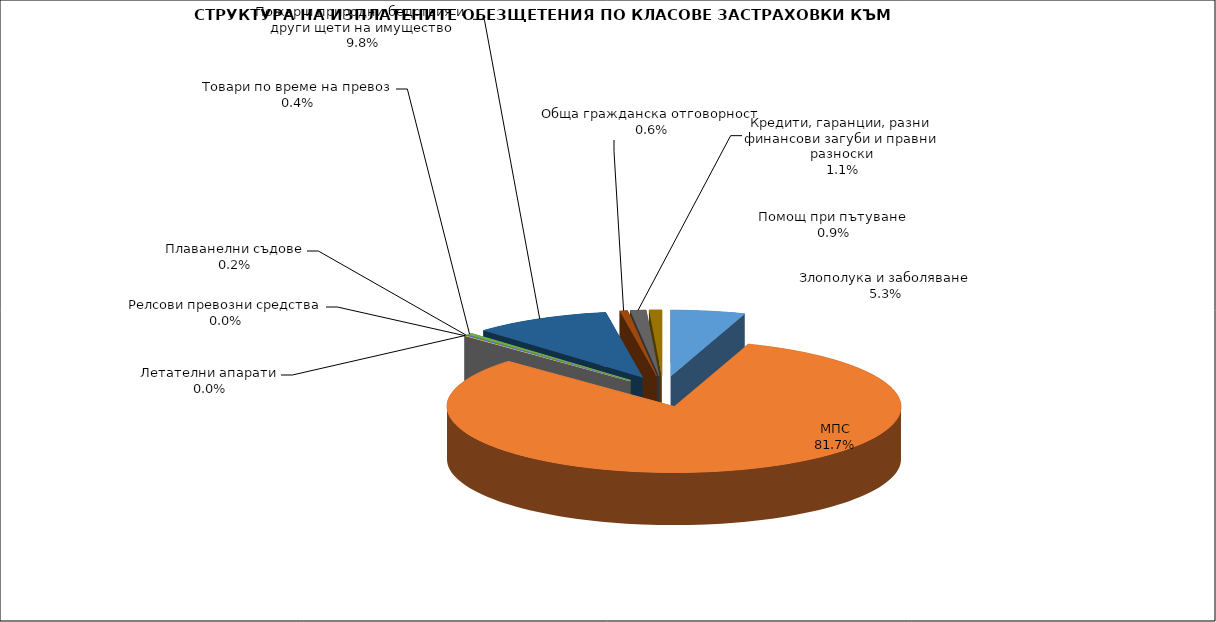
| Category | Series 0 |
|---|---|
| Злополука и заболяване | 0.053 |
| МПС | 0.817 |
| Релсови превозни средства | 0 |
| Летателни апарати | 0 |
| Плаванелни съдове | 0.002 |
| Товари по време на превоз | 0.004 |
| Пожар и природни бедствия и други щети на имущество | 0.098 |
| Обща гражданска отговорност | 0.006 |
| Кредити, гаранции, разни финансови загуби и правни разноски | 0.011 |
| Помощ при пътуване | 0.009 |